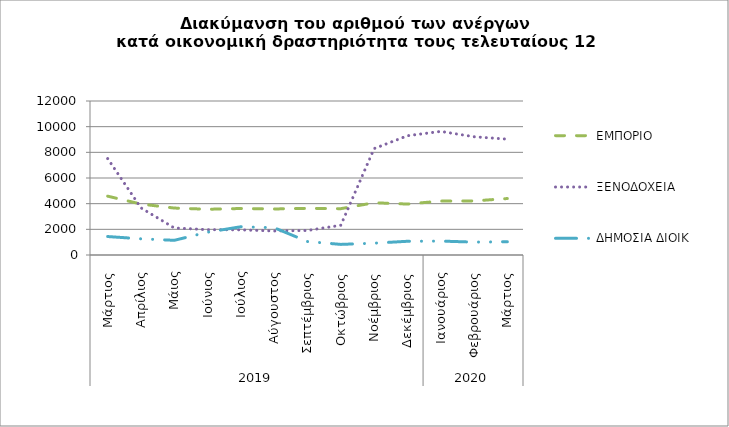
| Category | ΕΜΠΟΡΙΟ | ΞΕΝΟΔΟΧΕΙΑ | ΔΗΜΟΣΙΑ ΔΙΟΙΚ |
|---|---|---|---|
| 0 | 4585 | 7515 | 1439 |
| 1 | 3970 | 3672 | 1261 |
| 2 | 3658 | 2108 | 1144 |
| 3 | 3564 | 1972 | 1777 |
| 4 | 3623 | 1961 | 2202 |
| 5 | 3586 | 1872 | 2125 |
| 6 | 3637 | 1911 | 1050 |
| 7 | 3610 | 2319 | 826 |
| 8 | 4072 | 8292 | 922 |
| 9 | 3969 | 9290 | 1069 |
| 10 | 4202 | 9632 | 1085 |
| 11 | 4212 | 9214 | 1003 |
| 12 | 4400 | 9028 | 1034 |